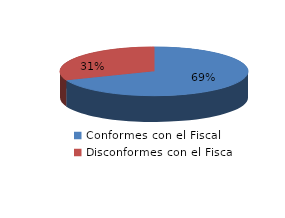
| Category | Series 0 |
|---|---|
| 0 | 69 |
| 1 | 31 |